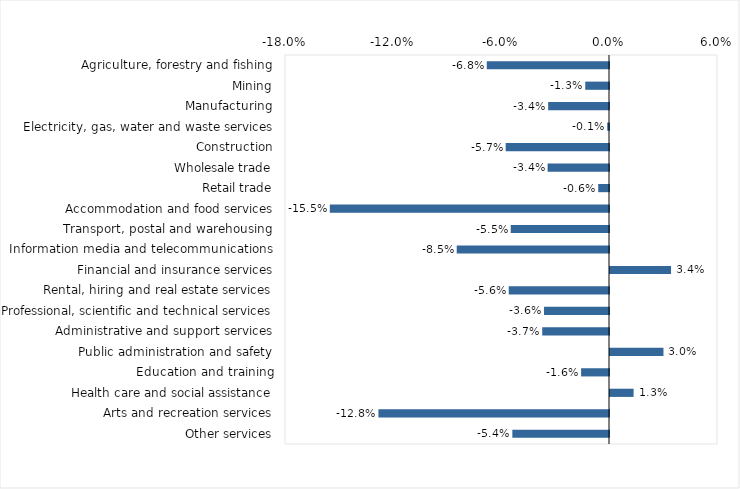
| Category | This week |
|---|---|
| Agriculture, forestry and fishing | -0.068 |
| Mining | -0.013 |
| Manufacturing | -0.034 |
| Electricity, gas, water and waste services | -0.001 |
| Construction | -0.057 |
| Wholesale trade | -0.034 |
| Retail trade | -0.006 |
| Accommodation and food services | -0.155 |
| Transport, postal and warehousing | -0.055 |
| Information media and telecommunications | -0.085 |
| Financial and insurance services | 0.034 |
| Rental, hiring and real estate services | -0.056 |
| Professional, scientific and technical services | -0.036 |
| Administrative and support services | -0.037 |
| Public administration and safety | 0.03 |
| Education and training | -0.016 |
| Health care and social assistance | 0.013 |
| Arts and recreation services | -0.128 |
| Other services | -0.054 |